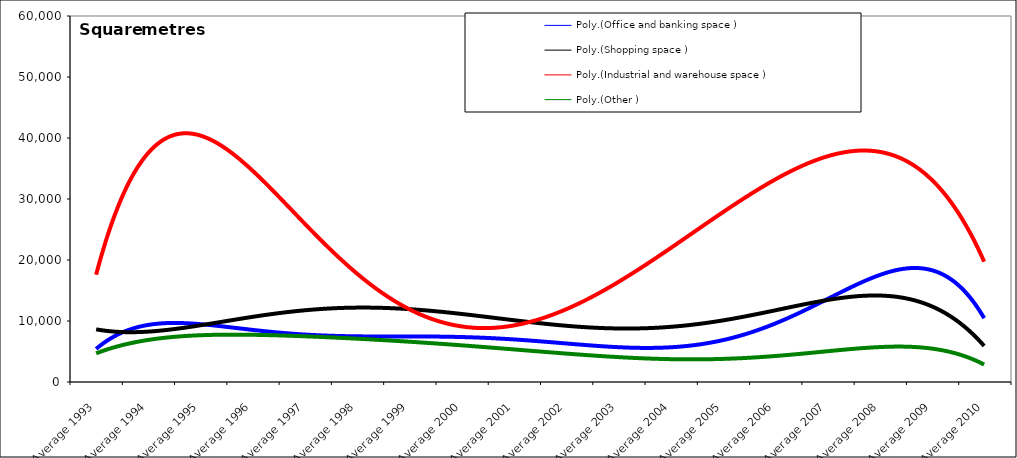
| Category | Office and banking space | Shopping space | Industrial and warehouse space | Other |
|---|---|---|---|---|
| Average 1993 | 3840.083 | 7911.75 | 19273.167 | 4569 |
| Average 1994 | 14243.75 | 9089 | 29577.667 | 7634.167 |
| Average 1995 | 5982.917 | 12454.333 | 51713.583 | 6208.583 |
| Average 1996 | 7401 | 6991.167 | 33714.917 | 8724.417 |
| Average 1997 | 8324.833 | 9341.167 | 19005.25 | 7786.417 |
| Average 1998 | 7065.167 | 8364.5 | 18962.167 | 6520.667 |
| Average 1999 | 9990.25 | 26515.833 | 8909.75 | 7421.75 |
| Average 2000 | 4690.667 | 7060.75 | 14173.083 | 4495.833 |
| Average 2001 | 11529.75 | 3186 | 11034 | 5105.417 |
| Average 2002 | 4412.583 | 10516.583 | 13680.167 | 7202.417 |
| Average 2003 | 2711.083 | 11288.083 | 14080.917 | 2677.583 |
| Average 2004 | 6691.417 | 7099.083 | 15809 | 3761.583 |
| Average 2005 | 5342.583 | 13125.25 | 30065.667 | 2859.917 |
| Average 2006 | 13978.25 | 9684.833 | 37507.5 | 4979.5 |
| Average 2007 | 10468 | 12652.167 | 32661.917 | 5926.75 |
| Average 2008 | 20702.417 | 16911.417 | 44614.75 | 4597.167 |
| Average 2009 | 15222.167 | 10115.917 | 26641.917 | 5877.083 |
| Average 2010 | 11274.857 | 6403.714 | 21353.429 | 2752.857 |